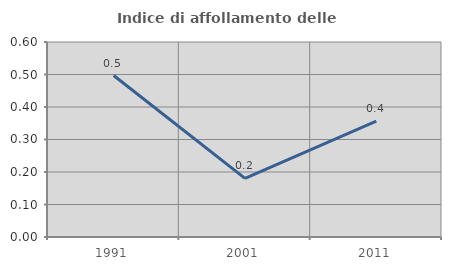
| Category | Indice di affollamento delle abitazioni  |
|---|---|
| 1991.0 | 0.497 |
| 2001.0 | 0.18 |
| 2011.0 | 0.356 |